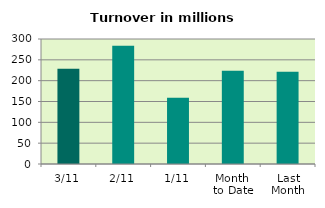
| Category | Series 0 |
|---|---|
| 3/11 | 228.302 |
| 2/11 | 283.962 |
| 1/11 | 158.934 |
| Month 
to Date | 223.733 |
| Last
Month | 221.516 |